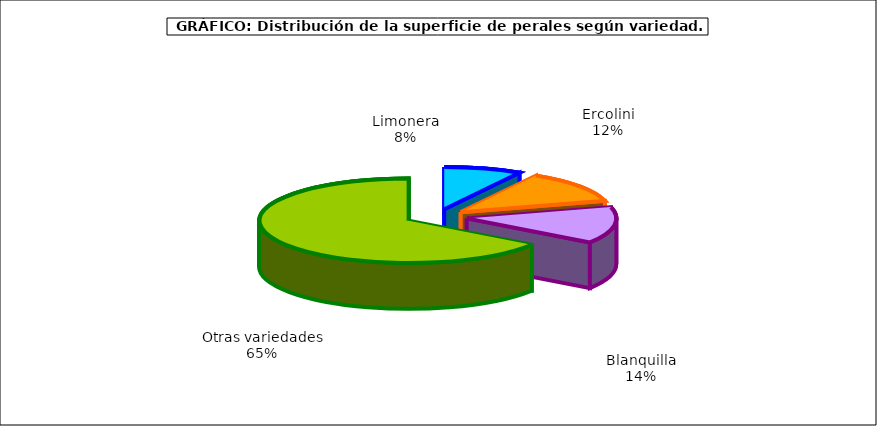
| Category | superficie |
|---|---|
| 0 | 1.79 |
| 1 | 2.622 |
| 2 | 2.97 |
| 3 | 13.947 |